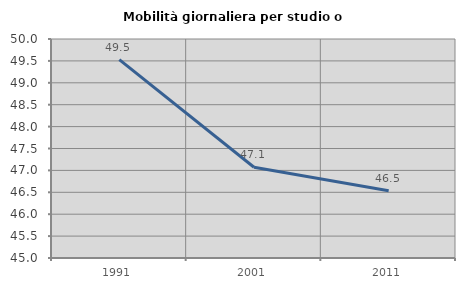
| Category | Mobilità giornaliera per studio o lavoro |
|---|---|
| 1991.0 | 49.528 |
| 2001.0 | 47.073 |
| 2011.0 | 46.536 |